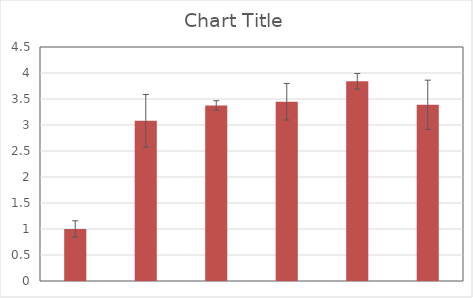
| Category | Series 1 |
|---|---|
| 0 | 1 |
| 1 | 3.08 |
| 2 | 3.376 |
| 3 | 3.446 |
| 4 | 3.842 |
| 5 | 3.389 |